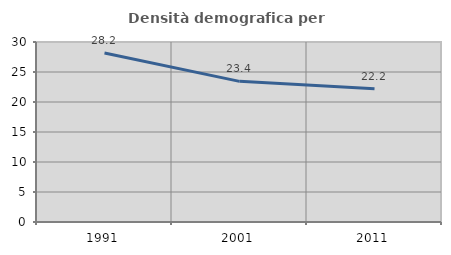
| Category | Densità demografica |
|---|---|
| 1991.0 | 28.173 |
| 2001.0 | 23.439 |
| 2011.0 | 22.209 |